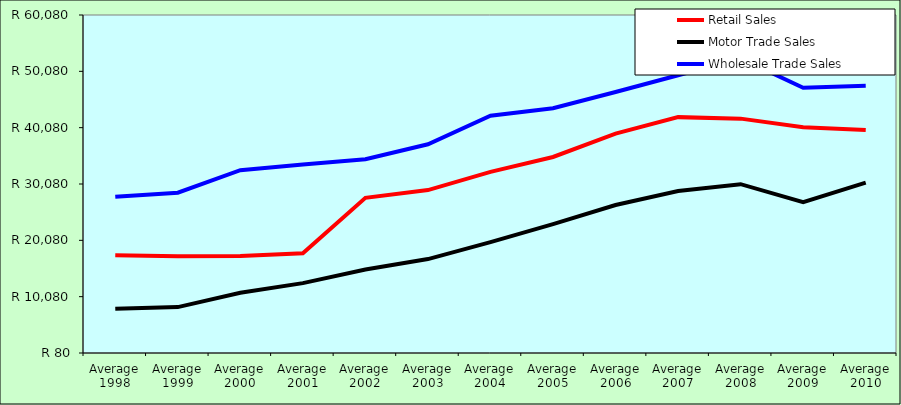
| Category | Retail Sales  | Motor Trade Sales | Wholesale Trade Sales |
|---|---|---|---|
| Average 1998 | 17425.5 | 7921 | 27807.333 |
| Average 1999 | 17237.583 | 8232 | 28532.333 |
| Average 2000 | 17300.667 | 10762.917 | 32527.5 |
| Average 2001 | 17772.833 | 12482.167 | 33522.417 |
| Average 2002 | 27629.667 | 14908.167 | 34464.917 |
| Average 2003 | 28996.167 | 16750.333 | 37136.333 |
| Average 2004 | 32240.417 | 19767.75 | 42187.083 |
| Average 2005 | 34879.667 | 22950.75 | 43532.5 |
| Average 2006 | 39037.167 | 26349.667 | 46409.25 |
| Average 2007 | 41950.455 | 28832.273 | 49383.455 |
| Average 2008 | 41682.583 | 30045.167 | 52379.25 |
| Average 2009 | 40175 | 26852.75 | 47162.167 |
| Average 2010 | 39656 | 30335.833 | 47519.333 |